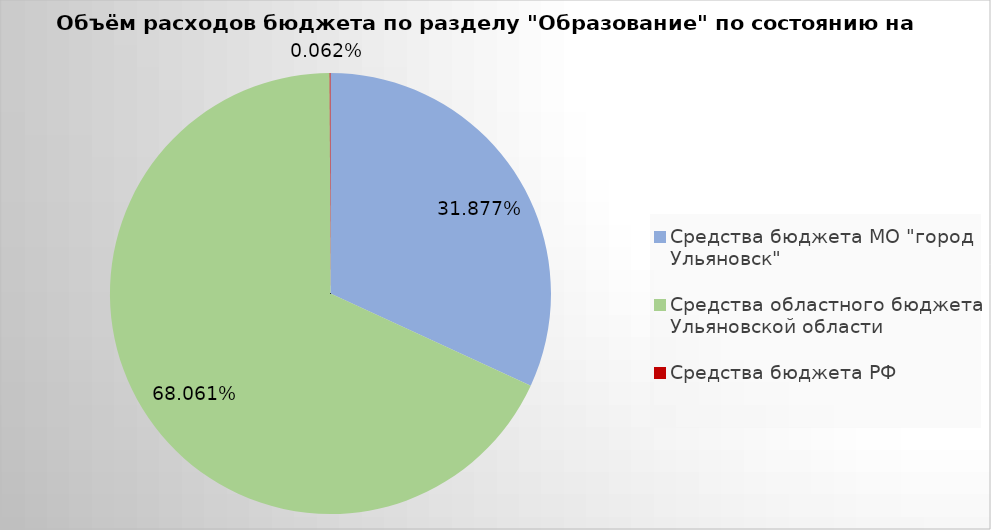
| Category | Series 0 |
|---|---|
| Средства бюджета МО "город Ульяновск" | 1688864.83 |
| Средства областного бюджета Ульяновской области | 3605943.07 |
| Средства бюджета РФ | 3283.27 |